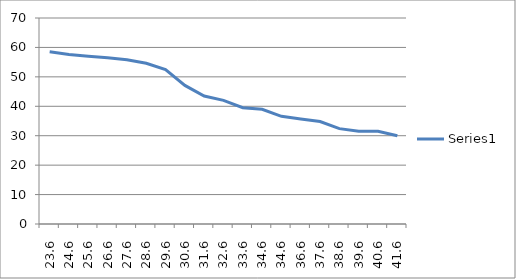
| Category | Series 0 |
|---|---|
| 23.6 | 58.5 |
| 24.6 | 57.6 |
| 25.6 | 57 |
| 26.6 | 56.5 |
| 27.6 | 55.8 |
| 28.6 | 54.6 |
| 29.6 | 52.5 |
| 30.6 | 47.1 |
| 31.6 | 43.5 |
| 32.6 | 42 |
| 33.6 | 39.5 |
| 34.6 | 39 |
| 34.6 | 36.6 |
| 36.6 | 35.7 |
| 37.6 | 34.8 |
| 38.6 | 32.4 |
| 39.6 | 31.5 |
| 40.6 | 31.5 |
| 41.6 | 30 |